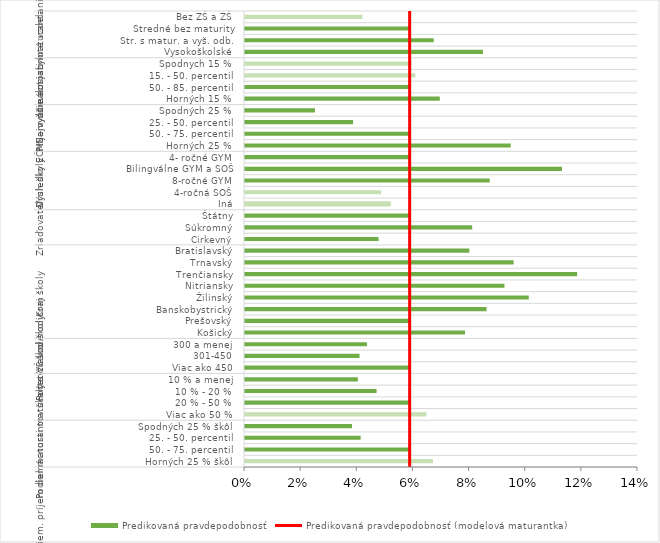
| Category | Predikovaná pravdepodobnosť |
|---|---|
| 0 | 0.067 |
| 1 | 0.059 |
| 2 | 0.041 |
| 3 | 0.038 |
| 4 | 0.065 |
| 5 | 0.059 |
| 6 | 0.047 |
| 7 | 0.04 |
| 8 | 0.059 |
| 9 | 0.041 |
| 10 | 0.043 |
| 11 | 0.078 |
| 12 | 0.059 |
| 13 | 0.086 |
| 14 | 0.101 |
| 15 | 0.092 |
| 16 | 0.118 |
| 17 | 0.096 |
| 18 | 0.08 |
| 19 | 0.048 |
| 20 | 0.081 |
| 21 | 0.059 |
| 22 | 0.052 |
| 23 | 0.048 |
| 24 | 0.087 |
| 25 | 0.113 |
| 26 | 0.059 |
| 27 | 0.095 |
| 28 | 0.059 |
| 29 | 0.039 |
| 30 | 0.025 |
| 31 | 0.069 |
| 32 | 0.059 |
| 33 | 0.061 |
| 34 | 0.059 |
| 35 | 0.085 |
| 36 | 0.067 |
| 37 | 0.059 |
| 38 | 0.042 |